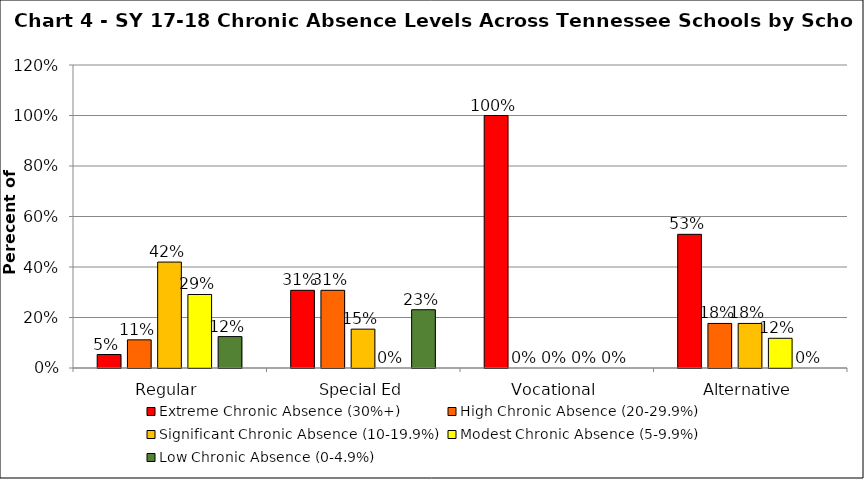
| Category | Extreme Chronic Absence (30%+) | High Chronic Absence (20-29.9%) | Significant Chronic Absence (10-19.9%) | Modest Chronic Absence (5-9.9%) | Low Chronic Absence (0-4.9%) |
|---|---|---|---|---|---|
| 0 | 0.053 | 0.112 | 0.42 | 0.291 | 0.124 |
| 1 | 0.308 | 0.308 | 0.154 | 0 | 0.231 |
| 2 | 1 | 0 | 0 | 0 | 0 |
| 3 | 0.529 | 0.176 | 0.176 | 0.118 | 0 |